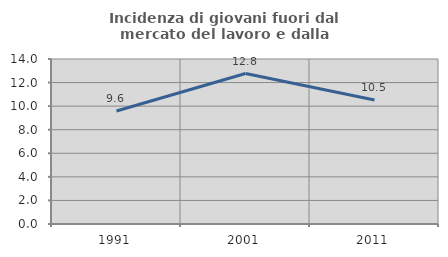
| Category | Incidenza di giovani fuori dal mercato del lavoro e dalla formazione  |
|---|---|
| 1991.0 | 9.589 |
| 2001.0 | 12.766 |
| 2011.0 | 10.526 |